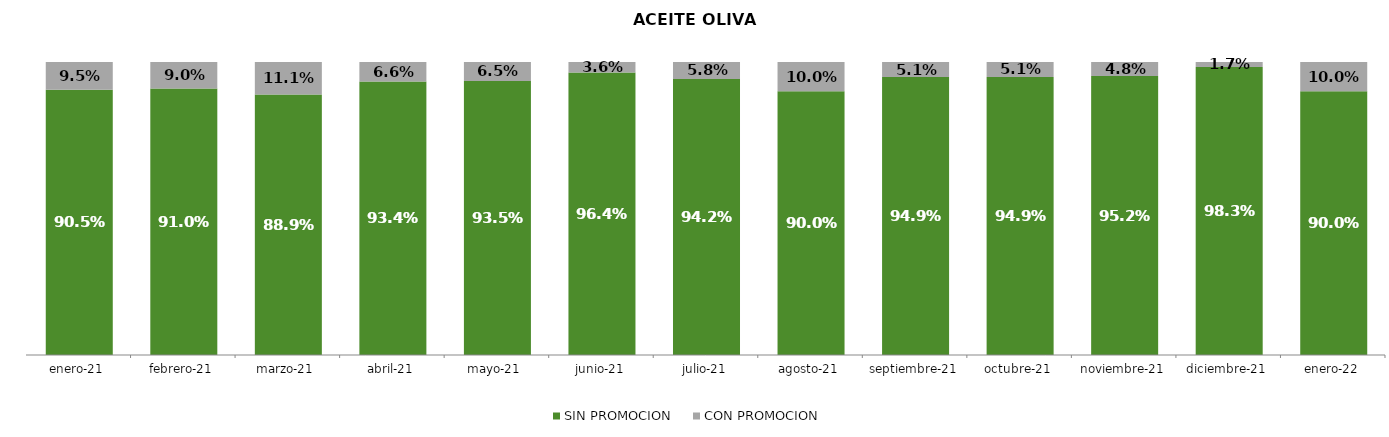
| Category | SIN PROMOCION   | CON PROMOCION   |
|---|---|---|
| 2021-01-01 | 0.905 | 0.095 |
| 2021-02-01 | 0.91 | 0.09 |
| 2021-03-01 | 0.889 | 0.111 |
| 2021-04-01 | 0.934 | 0.066 |
| 2021-05-01 | 0.935 | 0.065 |
| 2021-06-01 | 0.964 | 0.036 |
| 2021-07-01 | 0.942 | 0.058 |
| 2021-08-01 | 0.9 | 0.1 |
| 2021-09-01 | 0.949 | 0.051 |
| 2021-10-01 | 0.949 | 0.051 |
| 2021-11-01 | 0.952 | 0.048 |
| 2021-12-01 | 0.983 | 0.017 |
| 2022-01-01 | 0.9 | 0.1 |